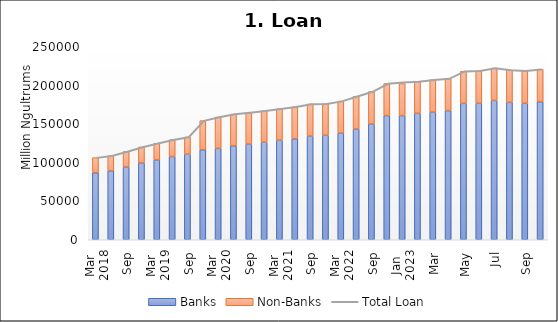
| Category | Banks | Non-Banks |
|---|---|---|
| 0 | 86839.062 | 19536.13 |
| 1 | 89492.789 | 19317.924 |
| 2 | 94257.106 | 19993.763 |
| 3 | 99542.627 | 20696.164 |
| 4 | 103455.022 | 21541.616 |
| 5 | 107823.786 | 21766.128 |
| 6 | 110793.514 | 22289.762 |
| 7 | 116541.685 | 37784.488 |
| 8 | 118433.441 | 40493.857 |
| 9 | 121831.338 | 40869.086 |
| 10 | 123947.936 | 40898.135 |
| 11 | 126363.799 | 40625.692 |
| 12 | 128951.639 | 40851.287 |
| 13 | 130897.833 | 41243.55 |
| 14 | 134359.87 | 41428.68 |
| 15 | 135415.887 | 40793.4 |
| 16 | 138284.661 | 41288.566 |
| 17 | 143532.338 | 42375.24 |
| 18 | 149966.968 | 41992.436 |
| 19 | 160873.72 | 41509.575 |
| 20 | 160873.72 | 41509.575 |
| 21 | 163784.222 | 41233.942 |
| 22 | 165428.061 | 41861.82 |
| 23 | 167303.912 | 41496.685 |
| 24 | 176700.108 | 41607.518 |
| 25 | 176977.708 | 41819.738 |
| 26 | 180513.181 | 41855.293 |
| 27 | 178011.08 | 41903.059 |
| 28 | 176771.277 | 42122.595 |
| 29 | 178802.345 | 42166.639 |